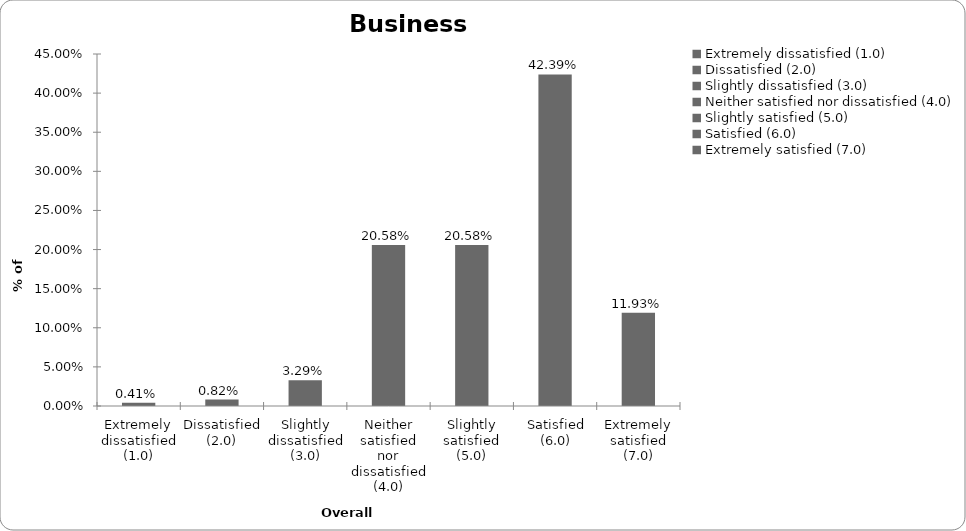
| Category | Business Interruption |
|---|---|
| Extremely dissatisfied (1.0) | 0.004 |
| Dissatisfied (2.0) | 0.008 |
| Slightly dissatisfied (3.0) | 0.033 |
| Neither satisfied nor dissatisfied (4.0) | 0.206 |
| Slightly satisfied (5.0) | 0.206 |
| Satisfied (6.0) | 0.424 |
| Extremely satisfied (7.0) | 0.119 |